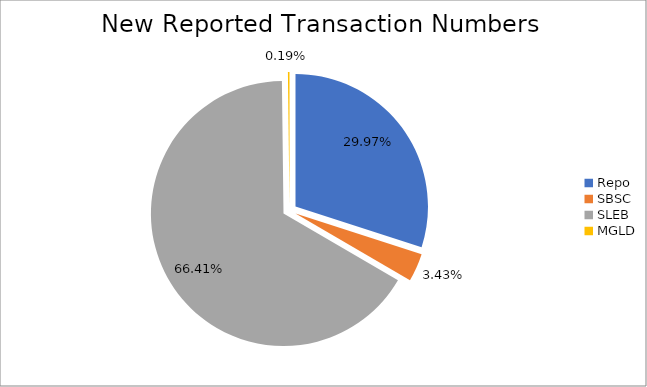
| Category | Series 0 |
|---|---|
| Repo | 399670 |
| SBSC | 45738 |
| SLEB | 885602 |
| MGLD | 2561 |